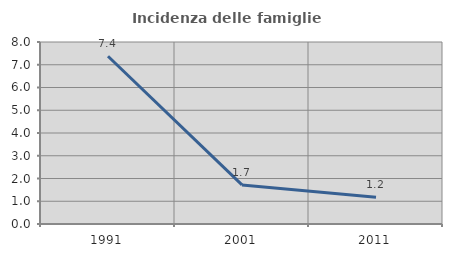
| Category | Incidenza delle famiglie numerose |
|---|---|
| 1991.0 | 7.373 |
| 2001.0 | 1.717 |
| 2011.0 | 1.175 |